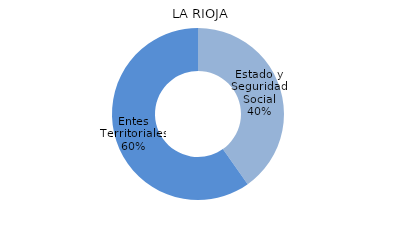
| Category | Series 0 |
|---|---|
| Estado y Seguridad Social | 39994 |
| Entes Territoriales | 59512 |